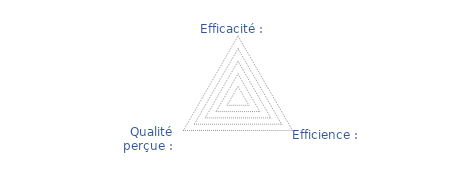
| Category | Tracé du Triangle de la Performance |
|---|---|
| Efficacité :   | 0 |
| Efficience :   | 0 |
| Qualité perçue :   | 0 |